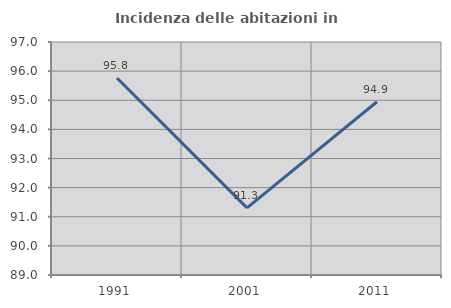
| Category | Incidenza delle abitazioni in proprietà  |
|---|---|
| 1991.0 | 95.763 |
| 2001.0 | 91.304 |
| 2011.0 | 94.949 |